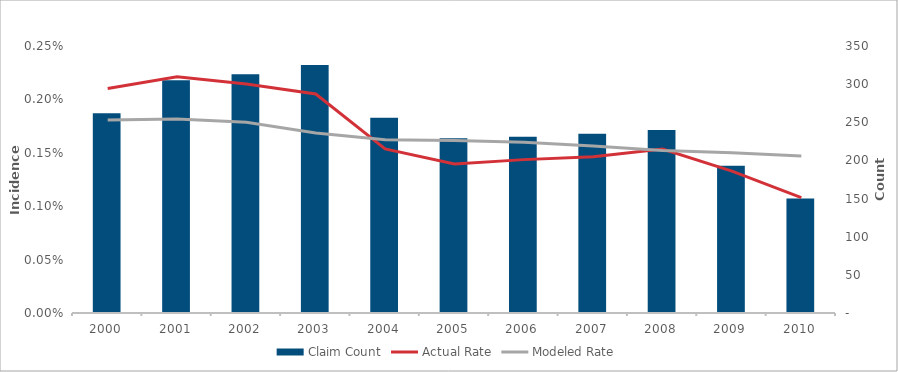
| Category | Claim Count |
|---|---|
| 2000.0 | 262 |
| 2001.0 | 305 |
| 2002.0 | 313 |
| 2003.0 | 325 |
| 2004.0 | 256 |
| 2005.0 | 229 |
| 2006.0 | 231 |
| 2007.0 | 235 |
| 2008.0 | 240 |
| 2009.0 | 193 |
| 2010.0 | 150 |